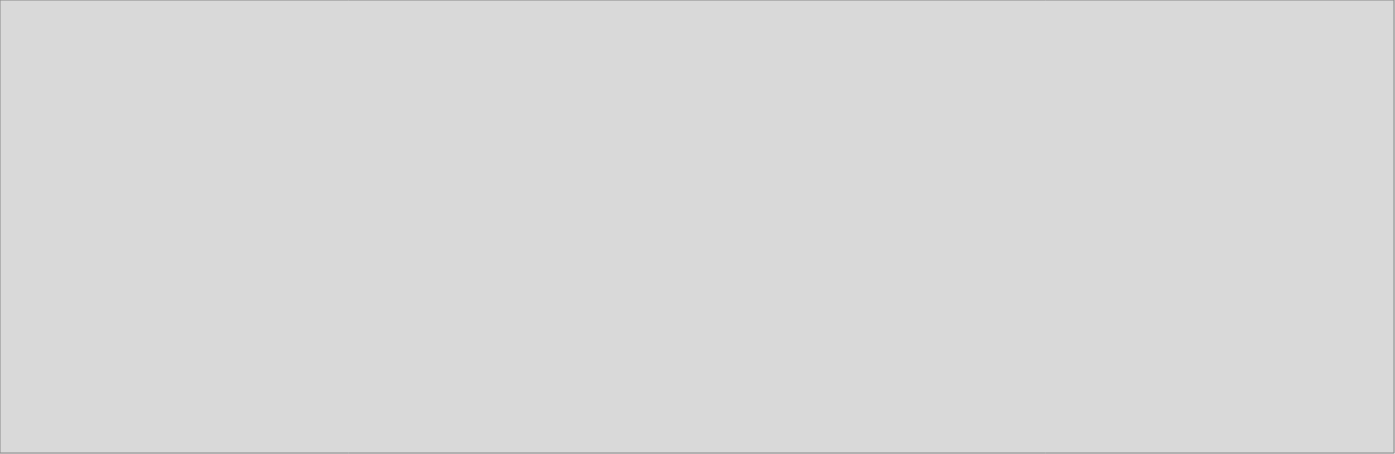
| Category | Explotación de Minas y Canteras |
|---|---|
| 2018_I | 1005.371 |
| 2018_II | 976.944 |
| 2018_III | 1103.226 |
| 2018_IV | 1115.132 |
| 2019_I | 1001.824 |
| 2019_II | 1093.758 |
| 2019_III | 0 |
| 2019_IV | 0 |